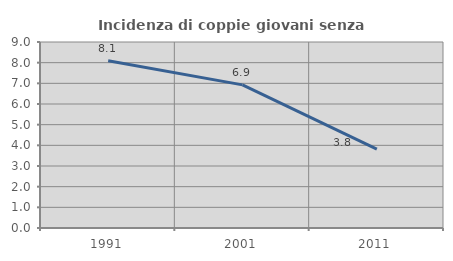
| Category | Incidenza di coppie giovani senza figli |
|---|---|
| 1991.0 | 8.091 |
| 2001.0 | 6.926 |
| 2011.0 | 3.815 |